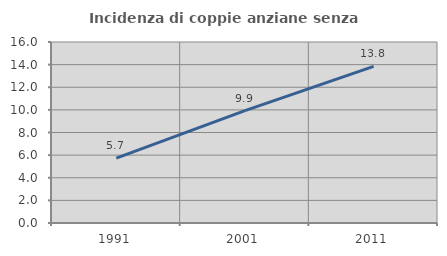
| Category | Incidenza di coppie anziane senza figli  |
|---|---|
| 1991.0 | 5.727 |
| 2001.0 | 9.94 |
| 2011.0 | 13.849 |